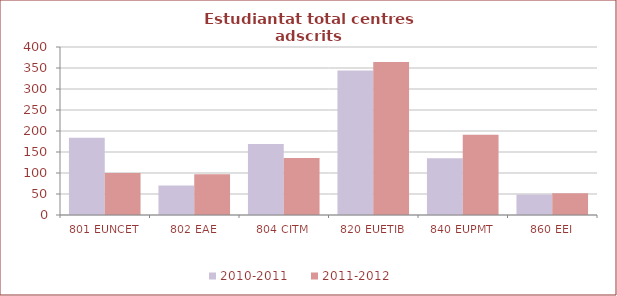
| Category | 2010-2011 | 2011-2012 |
|---|---|---|
| 801 EUNCET | 184 | 100 |
| 802 EAE | 70 | 97 |
| 804 CITM | 169 | 136 |
| 820 EUETIB | 344 | 364 |
| 840 EUPMT | 135 | 191 |
| 860 EEI | 49 | 52 |